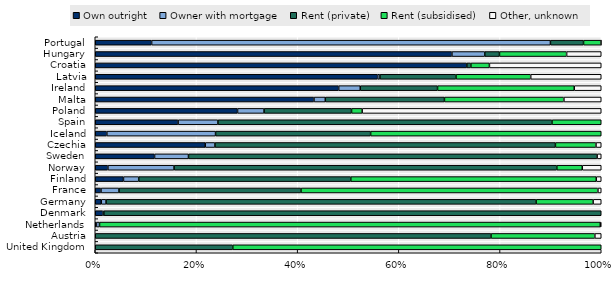
| Category | Own outright | Owner with mortgage | Rent (private) | Rent (subsidised) | Other, unknown |
|---|---|---|---|---|---|
| United Kingdom | 0 | 0 | 0.272 | 0.728 | 0 |
| Austria | 0 | 0 | 0.782 | 0.205 | 0.013 |
| Netherlands | 0.002 | 0.006 | 0 | 0.99 | 0.002 |
| Denmark | 0.015 | 0.002 | 0.983 | 0 | 0 |
| Germany | 0.012 | 0.009 | 0.85 | 0.113 | 0.016 |
| France | 0.011 | 0.036 | 0.36 | 0.587 | 0.007 |
| Finland | 0.056 | 0.03 | 0.419 | 0.485 | 0.01 |
| Norway | 0.025 | 0.131 | 0.756 | 0.05 | 0.037 |
| Sweden | 0.117 | 0.067 | 0.808 | 0 | 0.008 |
| Czechia | 0.217 | 0.019 | 0.673 | 0.08 | 0.01 |
| Iceland | 0.023 | 0.215 | 0.306 | 0.456 | 0 |
| Spain | 0.164 | 0.079 | 0.66 | 0.097 | 0 |
| Poland | 0.281 | 0.052 | 0.173 | 0.021 | 0.472 |
| Malta | 0.432 | 0.022 | 0.235 | 0.236 | 0.074 |
| Ireland | 0.481 | 0.043 | 0.153 | 0.27 | 0.053 |
| Latvia | 0.558 | 0.005 | 0.15 | 0.148 | 0.139 |
| Croatia | 0.734 | 0 | 0.008 | 0.037 | 0.221 |
| Hungary | 0.705 | 0.065 | 0.029 | 0.133 | 0.068 |
| Portugal | 0.111 | 0.788 | 0.065 | 0.035 | 0 |